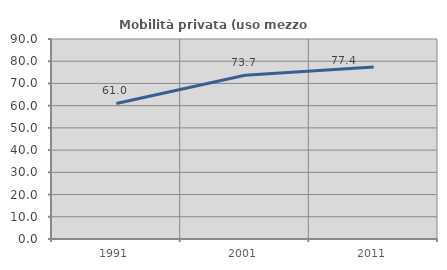
| Category | Mobilità privata (uso mezzo privato) |
|---|---|
| 1991.0 | 61.009 |
| 2001.0 | 73.703 |
| 2011.0 | 77.396 |